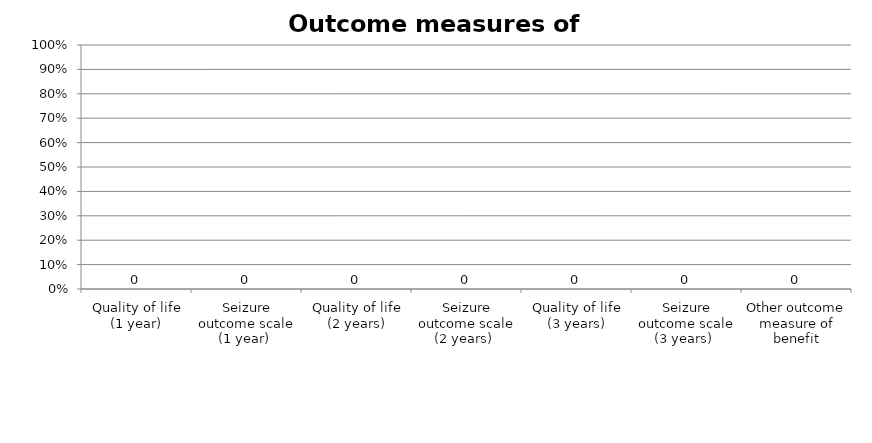
| Category | Series 0 |
|---|---|
| Quality of life (1 year) | 0 |
| Seizure outcome scale (1 year)  | 0 |
| Quality of life (2 years) | 0 |
| Seizure outcome scale (2 years)  | 0 |
| Quality of life (3 years) | 0 |
| Seizure outcome scale (3 years)  | 0 |
| Other outcome measure of benefit | 0 |